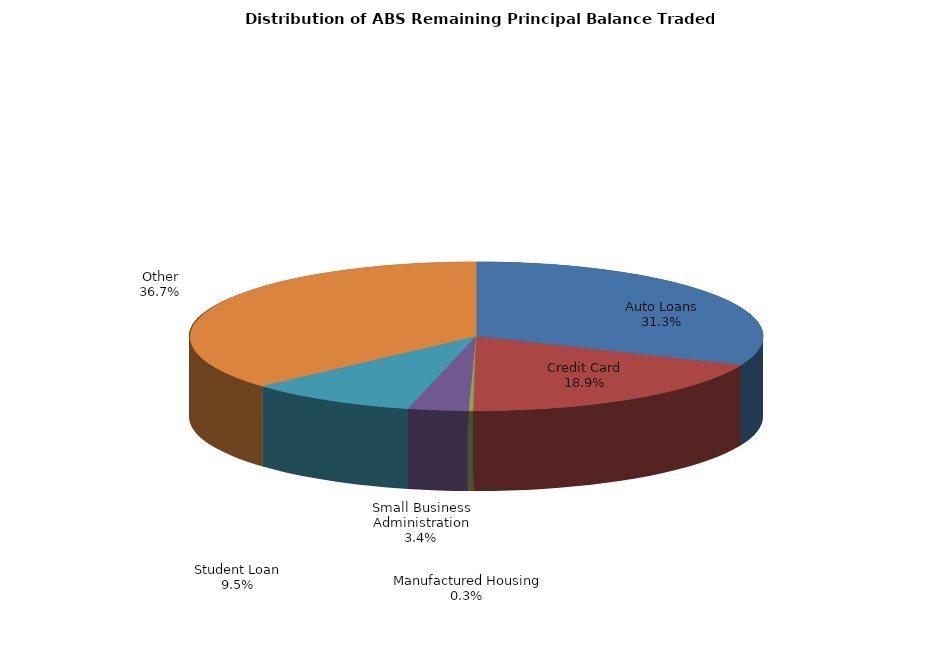
| Category | Series 0 |
|---|---|
| Auto Loans | 677384217.404 |
| Credit Card | 408359316.856 |
| Manufactured Housing | 5447398.676 |
| Small Business Administration | 73423098.428 |
| Student Loan | 206238360.393 |
| Other | 793904738.093 |